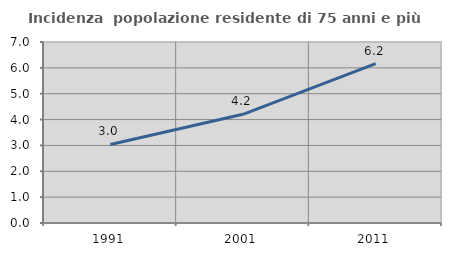
| Category | Incidenza  popolazione residente di 75 anni e più |
|---|---|
| 1991.0 | 3.037 |
| 2001.0 | 4.204 |
| 2011.0 | 6.166 |